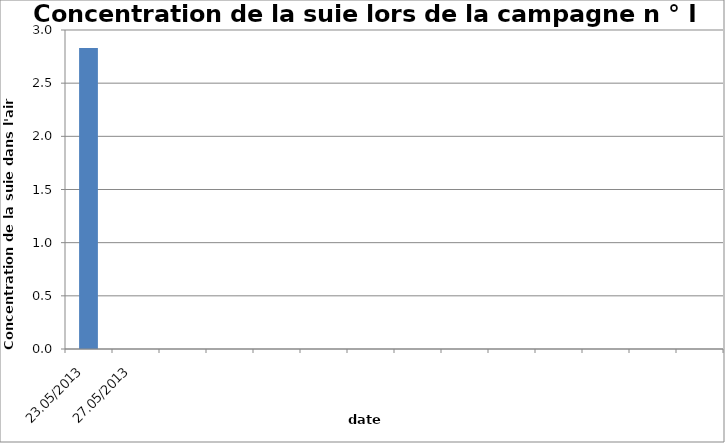
| Category | Series 0 |
|---|---|
| 23.05/2013 | 2.83 |
| 27.05/2013 | 0 |